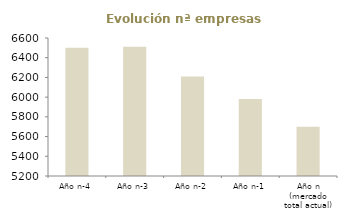
| Category | Evolución nª empresas (competidores) |
|---|---|
| Año n-4 | 6500 |
| Año n-3 | 6512 |
| Año n-2 | 6210 |
| Año n-1 | 5980 |
| Año n (mercado total actual) | 5700 |